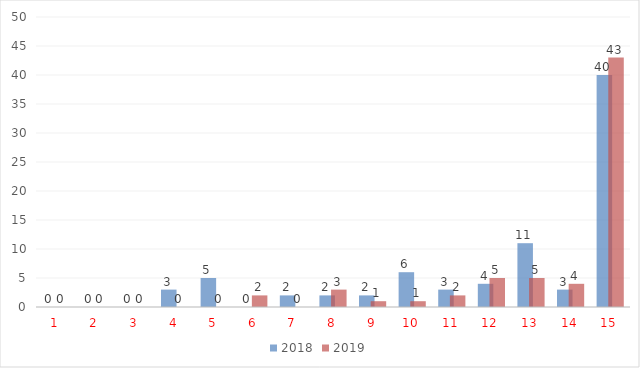
| Category | 2018 | 2019 |
|---|---|---|
| 0 | 0 | 0 |
| 1 | 0 | 0 |
| 2 | 0 | 0 |
| 3 | 3 | 0 |
| 4 | 5 | 0 |
| 5 | 0 | 2 |
| 6 | 2 | 0 |
| 7 | 2 | 3 |
| 8 | 2 | 1 |
| 9 | 6 | 1 |
| 10 | 3 | 2 |
| 11 | 4 | 5 |
| 12 | 11 | 5 |
| 13 | 3 | 4 |
| 14 | 40 | 43 |